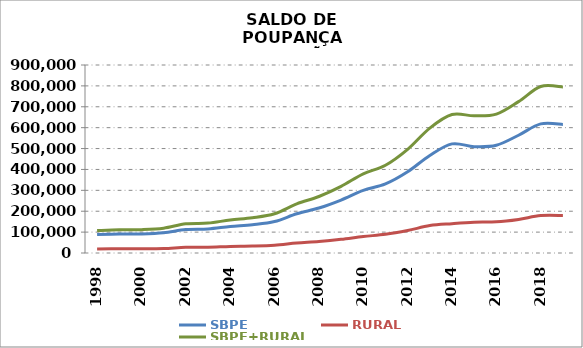
| Category | SBPE | RURAL | SBPE+RURAL |
|---|---|---|---|
| 1998 | 88538.349 | 18883.24 | 107421.589 |
| 1999 | 90437.74 | 20294.123 | 110731.863 |
| 2000 | 91430.45 | 20310.891 | 111741.341 |
| 2001 | 97146.25 | 21552.598 | 118698.848 |
| 2002 | 112423.444 | 27219.068 | 139642.512 |
| 2003 | 115258.021 | 27799.406 | 143057.427 |
| 2004 | 126853.217 | 31413.354 | 158266.571 |
| 2005 | 135411.681 | 33322.74 | 168734.421 |
| 2006 | 150412.546 | 37523.193 | 187935.739 |
| 2007 | 187827.264 | 47434.388 | 235261.652 |
| 2008 | 215400.282 | 54995.458 | 270395.74 |
| 2009 | 253604.98 | 65477.998 | 319082.978 |
| 2010 | 299878.217 | 78920.574 | 378798.791 |
| 2011 | 330569.272 | 89439.722 | 420008.994 |
| 2012 | 388641.662 | 107660.772 | 496302.434 |
| 2013 | 466788.644 | 131154.416 | 597943.06 |
| 2014 | 522343.501 | 140383.609 | 662727.11 |
| 2015 | 509223.044 | 147366.727 | 656589.771 |
| 2016 | 515955.43 | 149036.994 | 664992.424 |
| 2017 | 563741.675 | 160861.771 | 724603.446 |
| 2018 | 618146.063 | 179134.939 | 797281.002 |
| 2019* | 615687.332 | 179472.687 | 795160.019 |